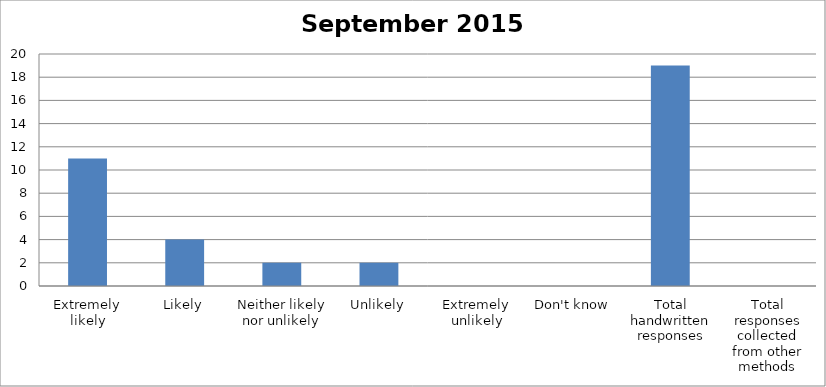
| Category | Series 0 |
|---|---|
| Extremely likely | 11 |
| Likely | 4 |
| Neither likely nor unlikely | 2 |
| Unlikely | 2 |
| Extremely unlikely | 0 |
| Don't know | 0 |
| Total handwritten responses | 19 |
| Total responses collected from other methods | 0 |